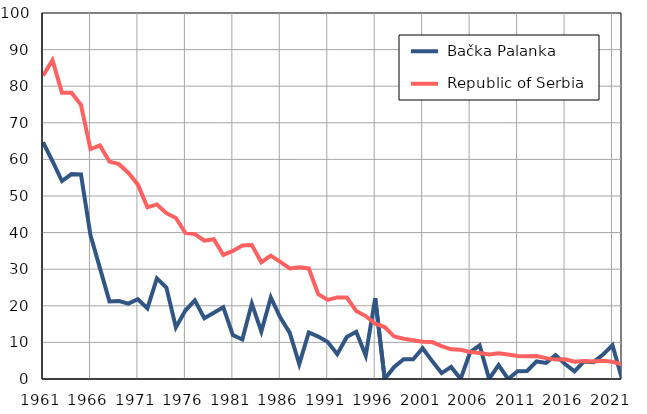
| Category |  Bačka Palanka |  Republic of Serbia |
|---|---|---|
| 1961.0 | 64.7 | 82.9 |
| 1962.0 | 59.5 | 87.1 |
| 1963.0 | 54.1 | 78.2 |
| 1964.0 | 56 | 78.2 |
| 1965.0 | 55.9 | 74.9 |
| 1966.0 | 39.3 | 62.8 |
| 1967.0 | 30.3 | 63.8 |
| 1968.0 | 21.2 | 59.4 |
| 1969.0 | 21.3 | 58.7 |
| 1970.0 | 20.6 | 56.3 |
| 1971.0 | 21.8 | 53.1 |
| 1972.0 | 19.3 | 46.9 |
| 1973.0 | 27.5 | 47.7 |
| 1974.0 | 25 | 45.3 |
| 1975.0 | 14.1 | 44 |
| 1976.0 | 18.7 | 39.9 |
| 1977.0 | 21.5 | 39.6 |
| 1978.0 | 16.6 | 37.8 |
| 1979.0 | 18.1 | 38.2 |
| 1980.0 | 19.6 | 33.9 |
| 1981.0 | 12 | 35 |
| 1982.0 | 10.8 | 36.5 |
| 1983.0 | 20.6 | 36.6 |
| 1984.0 | 13 | 31.9 |
| 1985.0 | 22.3 | 33.7 |
| 1986.0 | 16.8 | 32 |
| 1987.0 | 12.6 | 30.2 |
| 1988.0 | 4.1 | 30.5 |
| 1989.0 | 12.7 | 30.2 |
| 1990.0 | 11.6 | 23.2 |
| 1991.0 | 10.1 | 21.6 |
| 1992.0 | 6.8 | 22.3 |
| 1993.0 | 11.5 | 22.3 |
| 1994.0 | 12.9 | 18.6 |
| 1995.0 | 6.4 | 17.2 |
| 1996.0 | 22.1 | 15.1 |
| 1997.0 | 0 | 14.2 |
| 1998.0 | 3.3 | 11.6 |
| 1999.0 | 5.4 | 11 |
| 2000.0 | 5.4 | 10.6 |
| 2001.0 | 8.4 | 10.2 |
| 2002.0 | 4.9 | 10.1 |
| 2003.0 | 1.6 | 9 |
| 2004.0 | 3.3 | 8.1 |
| 2005.0 | 0 | 8 |
| 2006.0 | 7.3 | 7.4 |
| 2007.0 | 9.2 | 7.1 |
| 2008.0 | 0 | 6.7 |
| 2009.0 | 3.8 | 7 |
| 2010.0 | 0 | 6.7 |
| 2011.0 | 2.1 | 6.3 |
| 2012.0 | 2.2 | 6.2 |
| 2013.0 | 4.8 | 6.3 |
| 2014.0 | 4.4 | 5.7 |
| 2015.0 | 6.5 | 5.3 |
| 2016.0 | 4.1 | 5.4 |
| 2017.0 | 2.1 | 4.7 |
| 2018.0 | 4.8 | 4.9 |
| 2019.0 | 4.6 | 4.8 |
| 2020.0 | 6.7 | 5 |
| 2021.0 | 9.2 | 4.7 |
| 2022.0 | 0 | 4 |